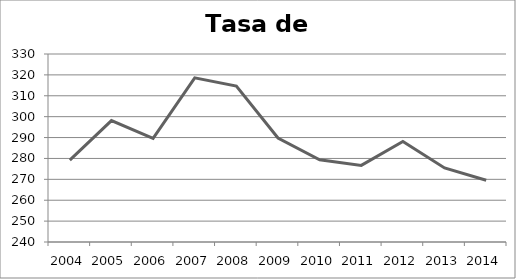
| Category | TASA DE CRIMINALIDAD |
|---|---|
| 2004.0 | 279.197 |
| 2005.0 | 298.136 |
| 2006.0 | 289.578 |
| 2007.0 | 318.58 |
| 2008.0 | 314.655 |
| 2009.0 | 289.76 |
| 2010.0 | 279.373 |
| 2011.0 | 276.682 |
| 2012.0 | 288.106 |
| 2013.0 | 275.447 |
| 2014.0 | 269.584 |